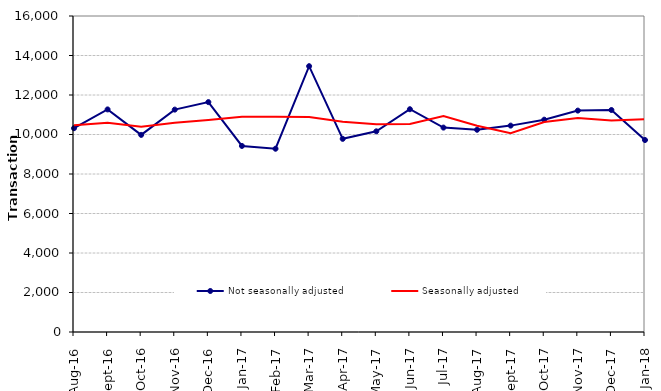
| Category | Not seasonally adjusted | Seasonally adjusted |
|---|---|---|
| 2016-08-01 | 10320 | 10470 |
| 2016-09-01 | 11270 | 10590 |
| 2016-10-01 | 9980 | 10390 |
| 2016-11-01 | 11260 | 10590 |
| 2016-12-01 | 11640 | 10740 |
| 2017-01-01 | 9420 | 10900 |
| 2017-02-01 | 9280 | 10900 |
| 2017-03-01 | 13460 | 10880 |
| 2017-04-01 | 9780 | 10650 |
| 2017-05-01 | 10160 | 10520 |
| 2017-06-01 | 11280 | 10530 |
| 2017-07-01 | 10350 | 10930 |
| 2017-08-01 | 10240 | 10440 |
| 2017-09-01 | 10450 | 10070 |
| 2017-10-01 | 10750 | 10630 |
| 2017-11-01 | 11210 | 10830 |
| 2017-12-01 | 11240 | 10710 |
| 2018-01-01 | 9720 | 10780 |